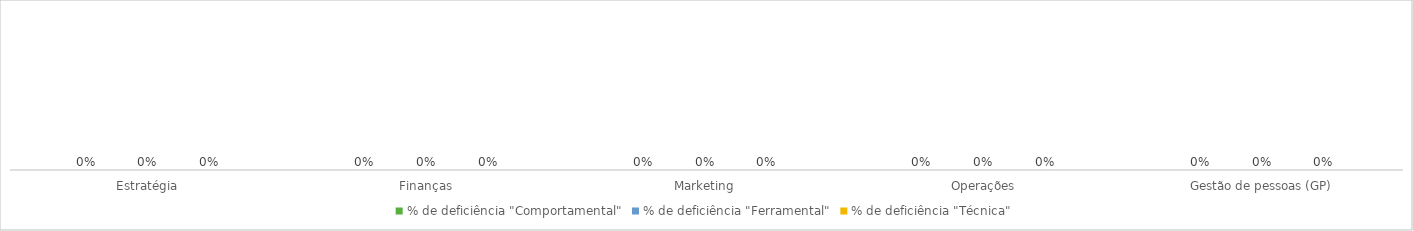
| Category | % de deficiência "Comportamental" | % de deficiência "Ferramental" | % de deficiência "Técnica" |
|---|---|---|---|
| Estratégia | 0 | 0 | 0 |
| Finanças | 0 | 0 | 0 |
| Marketing | 0 | 0 | 0 |
| Operações | 0 | 0 | 0 |
| Gestão de pessoas (GP) | 0 | 0 | 0 |